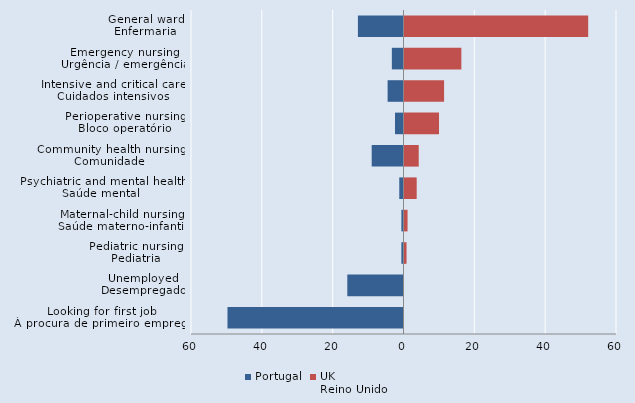
| Category | Portugal | UK
Reino Unido |
|---|---|---|
| General ward
Enfermaria | -12.874 | 52.149 |
| Emergency nursing
Urgência / emergência | -3.293 | 16.332 |
| Intensive and critical care
Cuidados intensivos | -4.491 | 11.461 |
| Perioperative nursing
Bloco operatório | -2.395 | 10.029 |
| Community health nursing
Comunidade | -8.982 | 4.298 |
| Psychiatric and mental health
Saúde mental | -1.198 | 3.725 |
| Maternal-child nursing
Saúde materno-infantil | -0.599 | 1.146 |
| Pediatric nursing
Pediatria | -0.599 | 0.86 |
| Unemployed
Desempregado | -15.868 | 0 |
| Looking for first job
À procura de primeiro emprego | -49.701 | 0 |